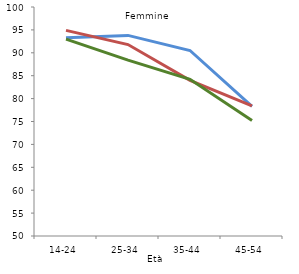
| Category | <=3 anni | 4-5 anni | 6+ anni |
|---|---|---|---|
| 14-24 | 93.3 | 94.9 | 93 |
| 25-34 | 93.8 | 91.8 | 88.4 |
| 35-44 | 90.5 | 84 | 84.2 |
| 45-54 | 78.3 | 78.4 | 75.2 |